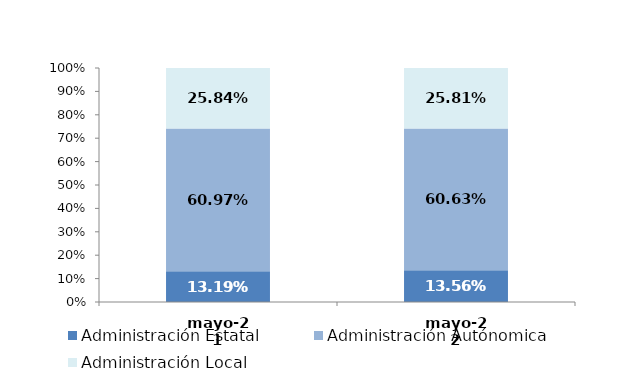
| Category | Administración Estatal | Administración Autónomica | Administración Local |
|---|---|---|---|
| 2021-05-01 | 0.132 | 0.61 | 0.258 |
| 2022-05-01 | 0.136 | 0.606 | 0.258 |